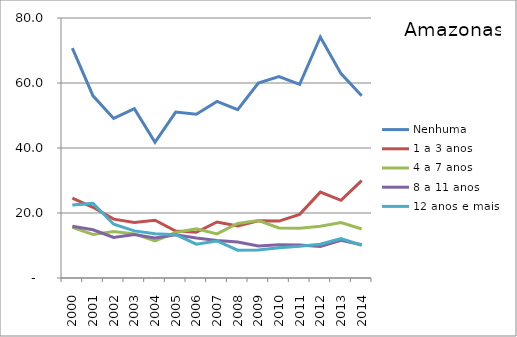
| Category | Nenhuma | 1 a 3 anos | 4 a 7 anos | 8 a 11 anos | 12 anos e mais |
|---|---|---|---|---|---|
| 2000.0 | 70.755 | 24.554 | 15.598 | 15.941 | 22.434 |
| 2001.0 | 56.051 | 21.747 | 13.425 | 14.826 | 22.952 |
| 2002.0 | 49.11 | 18.111 | 14.335 | 12.471 | 16.522 |
| 2003.0 | 52.083 | 17.09 | 13.557 | 13.381 | 14.499 |
| 2004.0 | 41.77 | 17.756 | 11.451 | 12.345 | 13.602 |
| 2005.0 | 51.046 | 14.441 | 13.978 | 13.303 | 13.331 |
| 2006.0 | 50.362 | 14.086 | 15.141 | 12.308 | 10.407 |
| 2007.0 | 54.319 | 17.224 | 13.584 | 11.56 | 11.396 |
| 2008.0 | 51.786 | 16.021 | 16.768 | 11.067 | 8.553 |
| 2009.0 | 59.991 | 17.618 | 17.696 | 9.88 | 8.591 |
| 2010.0 | 61.981 | 17.512 | 15.379 | 10.242 | 9.308 |
| 2011.0 | 59.581 | 19.581 | 15.346 | 10.183 | 9.77 |
| 2012.0 | 74.148 | 26.424 | 15.943 | 9.668 | 10.378 |
| 2013.0 | 62.887 | 23.891 | 17.06 | 11.591 | 12.099 |
| 2014.0 | 56.059 | 29.942 | 15.081 | 10.244 | 10.091 |